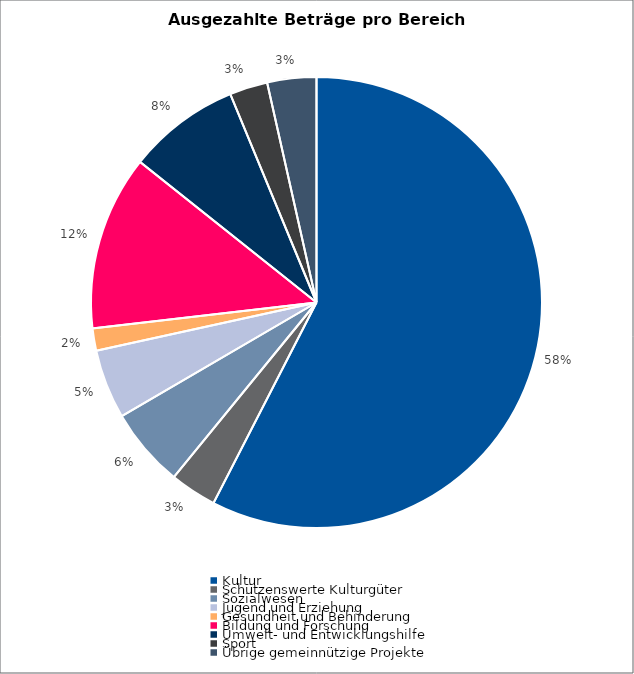
| Category | Series 0 |
|---|---|
| Kultur | 2209442.75 |
| Schützenswerte Kulturgüter | 128562.1 |
| Sozialwesen | 218290.45 |
| Jugend und Erziehung | 191196 |
| Gesundheit und Behinderung | 61227 |
| Bildung und Forschung | 481594.5 |
| Umwelt- und Entwicklungshilfe | 309000 |
| Sport | 104750 |
| Übrige gemeinnützige Projekte | 135000 |